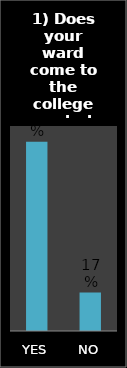
| Category | Series 0 |
|---|---|
| YES | 0.831 |
| NO | 0.169 |